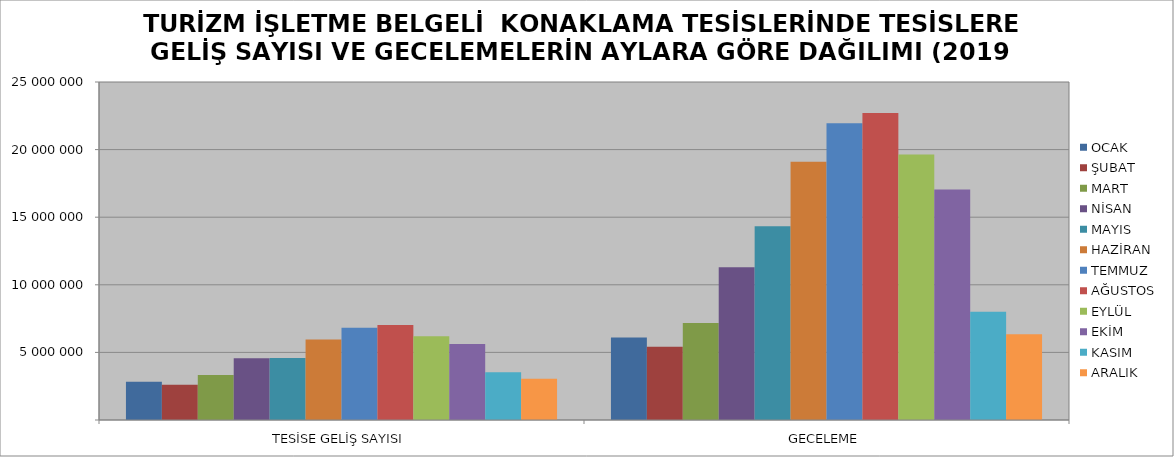
| Category | OCAK | ŞUBAT | MART | NİSAN | MAYIS | HAZİRAN | TEMMUZ | AĞUSTOS | EYLÜL | EKİM | KASIM | ARALIK |
|---|---|---|---|---|---|---|---|---|---|---|---|---|
| TESİSE GELİŞ SAYISI | 2833509 | 2607189 | 3326719 | 4561709 | 4585981 | 5949977 | 6830740 | 7020795 | 6189605 | 5614434 | 3537887 | 3055832 |
| GECELEME | 6098050 | 5425989 | 7182593 | 11302946 | 14338328 | 19092571 | 21955256 | 22706728 | 19635859 | 17054807 | 8015568 | 6340289 |